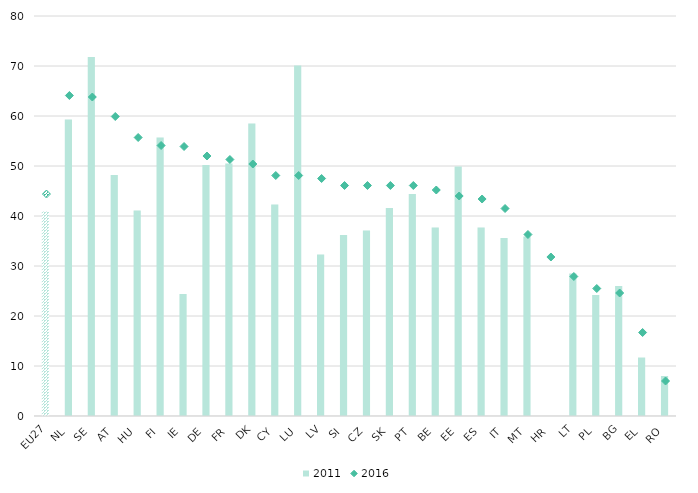
| Category | 2011 |
|---|---|
| EU27 | 40.9 |
| NL | 59.3 |
| SE | 71.8 |
| AT | 48.2 |
| HU | 41.1 |
| FI | 55.7 |
| IE | 24.4 |
| DE | 50.2 |
| FR | 50.5 |
| DK | 58.5 |
| CY | 42.3 |
| LU | 70.1 |
| LV | 32.3 |
| SI | 36.2 |
| CZ | 37.1 |
| SK | 41.6 |
| PT | 44.4 |
| BE | 37.7 |
| EE | 49.9 |
| ES | 37.7 |
| IT | 35.6 |
| MT | 35.9 |
| HR | 0 |
| LT | 28.5 |
| PL | 24.2 |
| BG | 26 |
| EL | 11.7 |
| RO | 8 |